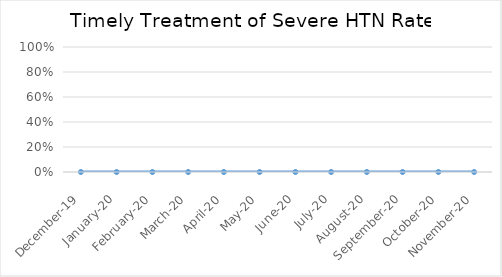
| Category | Rate |
|---|---|
| 2019-12-01 | 0 |
| 2020-01-01 | 0 |
| 2020-02-01 | 0 |
| 2020-03-01 | 0 |
| 2020-04-01 | 0 |
| 2020-05-01 | 0 |
| 2020-06-01 | 0 |
| 2020-07-01 | 0 |
| 2020-08-01 | 0 |
| 2020-09-01 | 0 |
| 2020-10-01 | 0 |
| 2020-11-01 | 0 |